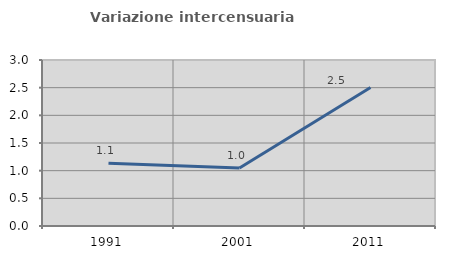
| Category | Variazione intercensuaria annua |
|---|---|
| 1991.0 | 1.133 |
| 2001.0 | 1.048 |
| 2011.0 | 2.502 |